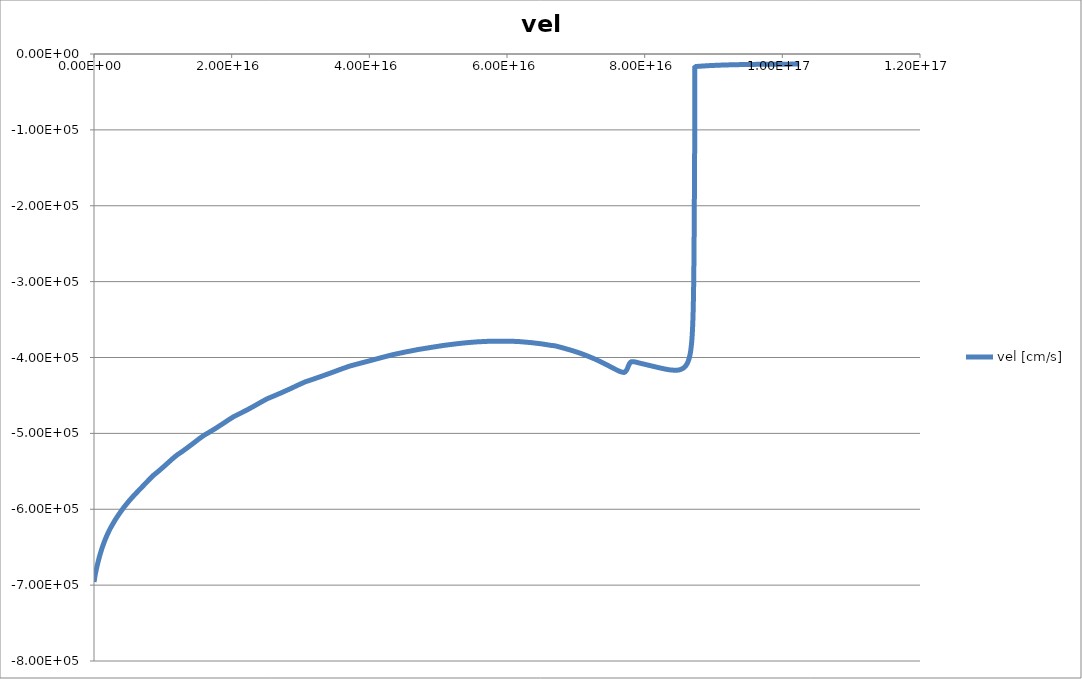
| Category | vel [cm/s] |
|---|---|
| 108724000000.0 | -695770 |
| 652347000000.0 | -695690 |
| 1765520000000.0 | -695610 |
| 3121850000000.0 | -695530 |
| 4477690000000.0 | -695430 |
| 5861580000000.0 | -695350 |
| 7465870000000.0 | -695260 |
| 9506710000000.0 | -695160 |
| 12102900000000.0 | -695050 |
| 15405600000000.0 | -694900 |
| 19606700000000.0 | -694710 |
| 24950200000000.0 | -694480 |
| 31746000000000.0 | -694180 |
| 40387700000000.0 | -693820 |
| 51374100000000.0 | -693360 |
| 65337800000000.0 | -692790 |
| 83079400000000.0 | -690980 |
| 105657000000000.0 | -690550 |
| 134384000000000.0 | -688380 |
| 170782000000000.0 | -687740 |
| 200660000000000.0 | -685150 |
| 220726000000000.0 | -684840 |
| 242798000000000.0 | -684250 |
| 267078000000000.0 | -682220 |
| 293786000000000.0 | -681790 |
| 323165000000000.0 | -679820 |
| 355481000000000.0 | -679310 |
| 391029000000000.0 | -677010 |
| 430132000000000.0 | -676410 |
| 473146000000000.0 | -673760 |
| 520460000000000.0 | -672080 |
| 572506000000000.0 | -670090 |
| 629757000000000.0 | -668040 |
| 692732000000000.0 | -665840 |
| 762006000000000.0 | -663510 |
| 838206000000000.0 | -661040 |
| 922027000000000.0 | -658430 |
| 1014230000000000.0 | -655680 |
| 1115650000000000.0 | -652780 |
| 1227220000000000.0 | -649720 |
| 1349940000000000.0 | -646530 |
| 1484930000000000.0 | -643220 |
| 1633430000000000.0 | -639770 |
| 1796770000000000.0 | -636210 |
| 1976450000000000.0 | -632530 |
| 2174090000000000.0 | -628730 |
| 2391500000000000.0 | -624830 |
| 2630650000000000.0 | -621020 |
| 2893710000000000.0 | -616860 |
| 3183090000000000.0 | -612590 |
| 3501400000000000.0 | -608180 |
| 3851530000000000.0 | -603630 |
| 4236690000000000.0 | -598730 |
| 4660360000000000.0 | -593820 |
| 5126390000000000.0 | -588710 |
| 5639030000000000.0 | -583460 |
| 6202930000000000.0 | -578000 |
| 6823230000000000.0 | -572170 |
| 7466670000000000.0 | -566050 |
| 8079730000000000.0 | -560290 |
| 8660840000000000.0 | -555050 |
| 9319990000000000.0 | -550260 |
| 1.00761e+16 | -544310 |
| 1.08106e+16 | -538300 |
| 1.14758e+16 | -532880 |
| 1.20988e+16 | -528280 |
| 1.28086e+16 | -523930 |
| 1.3648e+16 | -518380 |
| 1.44954e+16 | -512590 |
| 1.5267e+16 | -507170 |
| 1.59685e+16 | -502610 |
| 1.6748e+16 | -498490 |
| 1.76854e+16 | -493320 |
| 1.86561e+16 | -487590 |
| 1.95333e+16 | -482270 |
| 2.03022e+16 | -477910 |
| 2.11434e+16 | -474130 |
| 2.21747e+16 | -469380 |
| 2.32794e+16 | -463910 |
| 2.42933e+16 | -458650 |
| 2.51644e+16 | -454360 |
| 2.6098e+16 | -450840 |
| 2.72546e+16 | -446350 |
| 2.85085e+16 | -441220 |
| 2.96716e+16 | -436230 |
| 3.06794e+16 | -432110 |
| 3.17598e+16 | -428820 |
| 3.30903e+16 | -424630 |
| 3.45459e+16 | -419880 |
| 3.59324e+16 | -415200 |
| 3.716e+16 | -411270 |
| 3.84869e+16 | -408050 |
| 4.00673e+16 | -404270 |
| 4.17499e+16 | -400160 |
| 4.34319e+16 | -396220 |
| 4.51594e+16 | -392910 |
| 4.69794e+16 | -389660 |
| 4.88544e+16 | -386870 |
| 5.07359e+16 | -384160 |
| 5.25174e+16 | -382090 |
| 5.41581e+16 | -380470 |
| 5.56738e+16 | -379370 |
| 5.70718e+16 | -378760 |
| 5.83596e+16 | -378500 |
| 5.95503e+16 | -378430 |
| 6.06548e+16 | -378600 |
| 6.16782e+16 | -378970 |
| 6.26258e+16 | -379700 |
| 6.35019e+16 | -380400 |
| 6.43122e+16 | -381240 |
| 6.50601e+16 | -382090 |
| 6.5747e+16 | -383070 |
| 6.63787e+16 | -384040 |
| 6.67981e+16 | -384400 |
| 6.69549e+16 | -384600 |
| 6.70484e+16 | -384800 |
| 6.71701e+16 | -385060 |
| 6.73282e+16 | -385400 |
| 6.75337e+16 | -385940 |
| 6.78009e+16 | -386570 |
| 6.81482e+16 | -387410 |
| 6.85997e+16 | -388620 |
| 6.91121e+16 | -389930 |
| 6.96262e+16 | -391330 |
| 7.01404e+16 | -392830 |
| 7.06545e+16 | -394440 |
| 7.11686e+16 | -396150 |
| 7.16828e+16 | -397970 |
| 7.21969e+16 | -399900 |
| 7.27111e+16 | -401820 |
| 7.32252e+16 | -403980 |
| 7.37393e+16 | -406220 |
| 7.42427e+16 | -408500 |
| 7.46991e+16 | -410610 |
| 7.50801e+16 | -412460 |
| 7.53952e+16 | -413930 |
| 7.56684e+16 | -415210 |
| 7.59146e+16 | -416340 |
| 7.61358e+16 | -417320 |
| 7.633e+16 | -418090 |
| 7.64985e+16 | -418690 |
| 7.66461e+16 | -419050 |
| 7.67725e+16 | -419360 |
| 7.68467e+16 | -419480 |
| 7.68754e+16 | -419540 |
| 7.68956e+16 | -419580 |
| 7.69111e+16 | -419600 |
| 7.69237e+16 | -419640 |
| 7.69343e+16 | -419660 |
| 7.69437e+16 | -419680 |
| 7.6952e+16 | -419700 |
| 7.69595e+16 | -419710 |
| 7.69663e+16 | -419730 |
| 7.69726e+16 | -419730 |
| 7.69785e+16 | -419740 |
| 7.69838e+16 | -419740 |
| 7.69887e+16 | -419740 |
| 7.69932e+16 | -419740 |
| 7.69975e+16 | -419730 |
| 7.70018e+16 | -419720 |
| 7.70062e+16 | -419710 |
| 7.70105e+16 | -419720 |
| 7.70149e+16 | -419700 |
| 7.70193e+16 | -419660 |
| 7.70237e+16 | -419520 |
| 7.7028e+16 | -419490 |
| 7.70324e+16 | -419460 |
| 7.70367e+16 | -419460 |
| 7.70411e+16 | -419430 |
| 7.70462e+16 | -419420 |
| 7.70527e+16 | -419390 |
| 7.70612e+16 | -419370 |
| 7.70723e+16 | -419330 |
| 7.70867e+16 | -419260 |
| 7.71054e+16 | -419190 |
| 7.71297e+16 | -419090 |
| 7.71613e+16 | -418940 |
| 7.72024e+16 | -418680 |
| 7.72558e+16 | -418130 |
| 7.73253e+16 | -417330 |
| 7.74156e+16 | -415930 |
| 7.751e+16 | -414040 |
| 7.75895e+16 | -412190 |
| 7.76726e+16 | -410310 |
| 7.77807e+16 | -408240 |
| 7.79212e+16 | -406510 |
| 7.81039e+16 | -405460 |
| 7.83414e+16 | -405520 |
| 7.86502e+16 | -405920 |
| 7.90515e+16 | -406870 |
| 7.95355e+16 | -407970 |
| 8.00496e+16 | -409070 |
| 8.05637e+16 | -410190 |
| 8.10779e+16 | -411310 |
| 8.1592e+16 | -412400 |
| 8.21061e+16 | -413540 |
| 8.26202e+16 | -414550 |
| 8.31344e+16 | -415500 |
| 8.36485e+16 | -416300 |
| 8.41481e+16 | -416660 |
| 8.45951e+16 | -416790 |
| 8.49657e+16 | -416480 |
| 8.52717e+16 | -415600 |
| 8.55359e+16 | -414450 |
| 8.57711e+16 | -412950 |
| 8.59795e+16 | -410820 |
| 8.61592e+16 | -408290 |
| 8.63113e+16 | -405270 |
| 8.64404e+16 | -401840 |
| 8.65514e+16 | -397920 |
| 8.66477e+16 | -393370 |
| 8.6731e+16 | -388230 |
| 8.68004e+16 | -382690 |
| 8.68558e+16 | -376960 |
| 8.69002e+16 | -371240 |
| 8.69357e+16 | -365670 |
| 8.69641e+16 | -360360 |
| 8.69869e+16 | -355420 |
| 8.7005e+16 | -350910 |
| 8.70196e+16 | -346880 |
| 8.70316e+16 | -343240 |
| 8.70424e+16 | -339700 |
| 8.70527e+16 | -336070 |
| 8.70624e+16 | -332350 |
| 8.70712e+16 | -328690 |
| 8.70792e+16 | -325170 |
| 8.70864e+16 | -321760 |
| 8.70931e+16 | -318380 |
| 8.70994e+16 | -315000 |
| 8.71053e+16 | -311650 |
| 8.71109e+16 | -308350 |
| 8.7116e+16 | -305120 |
| 8.71209e+16 | -301940 |
| 8.71254e+16 | -298790 |
| 8.71298e+16 | -295660 |
| 8.71339e+16 | -292580 |
| 8.71378e+16 | -289540 |
| 8.71415e+16 | -286540 |
| 8.71451e+16 | -283580 |
| 8.71485e+16 | -280650 |
| 8.71517e+16 | -277750 |
| 8.71548e+16 | -274890 |
| 8.71578e+16 | -272060 |
| 8.71606e+16 | -269270 |
| 8.71634e+16 | -266510 |
| 8.71661e+16 | -263770 |
| 8.71686e+16 | -261070 |
| 8.71711e+16 | -258410 |
| 8.71735e+16 | -255770 |
| 8.71758e+16 | -253160 |
| 8.71781e+16 | -250580 |
| 8.71803e+16 | -248030 |
| 8.71824e+16 | -245500 |
| 8.71845e+16 | -243010 |
| 8.71865e+16 | -240540 |
| 8.71885e+16 | -238100 |
| 8.71904e+16 | -235690 |
| 8.71923e+16 | -233300 |
| 8.71941e+16 | -230940 |
| 8.71959e+16 | -228600 |
| 8.71976e+16 | -226290 |
| 8.71993e+16 | -224010 |
| 8.7201e+16 | -221740 |
| 8.72026e+16 | -219510 |
| 8.72042e+16 | -217290 |
| 8.72058e+16 | -215100 |
| 8.72074e+16 | -212930 |
| 8.72089e+16 | -210790 |
| 8.72104e+16 | -208660 |
| 8.72118e+16 | -206560 |
| 8.72133e+16 | -204480 |
| 8.72147e+16 | -202420 |
| 8.72161e+16 | -200390 |
| 8.72175e+16 | -198370 |
| 8.72188e+16 | -196380 |
| 8.72202e+16 | -194400 |
| 8.72215e+16 | -192450 |
| 8.72228e+16 | -190510 |
| 8.7224e+16 | -188600 |
| 8.72253e+16 | -186700 |
| 8.72265e+16 | -184820 |
| 8.72277e+16 | -182960 |
| 8.72289e+16 | -181130 |
| 8.72301e+16 | -179300 |
| 8.72312e+16 | -177500 |
| 8.72324e+16 | -175710 |
| 8.72335e+16 | -173950 |
| 8.72346e+16 | -172200 |
| 8.72357e+16 | -170460 |
| 8.72367e+16 | -168750 |
| 8.72378e+16 | -167050 |
| 8.72388e+16 | -165370 |
| 8.72398e+16 | -163700 |
| 8.72408e+16 | -162060 |
| 8.72418e+16 | -160430 |
| 8.72428e+16 | -158810 |
| 8.72437e+16 | -157210 |
| 8.72446e+16 | -155630 |
| 8.72456e+16 | -154070 |
| 8.72465e+16 | -152520 |
| 8.72474e+16 | -150980 |
| 8.72482e+16 | -149460 |
| 8.72491e+16 | -147950 |
| 8.725e+16 | -146430 |
| 8.72509e+16 | -144900 |
| 8.72517e+16 | -143360 |
| 8.72526e+16 | -141820 |
| 8.72535e+16 | -140270 |
| 8.72543e+16 | -138720 |
| 8.72552e+16 | -137170 |
| 8.72561e+16 | -135600 |
| 8.7257e+16 | -134040 |
| 8.72578e+16 | -132480 |
| 8.72587e+16 | -130910 |
| 8.72596e+16 | -129350 |
| 8.72605e+16 | -127770 |
| 8.72613e+16 | -126200 |
| 8.72622e+16 | -124630 |
| 8.72631e+16 | -123050 |
| 8.72639e+16 | -121460 |
| 8.72648e+16 | -119870 |
| 8.72657e+16 | -118280 |
| 8.72666e+16 | -116670 |
| 8.72674e+16 | -115050 |
| 8.72683e+16 | -113400 |
| 8.72692e+16 | -111730 |
| 8.72701e+16 | -110030 |
| 8.72709e+16 | -108290 |
| 8.72718e+16 | -106490 |
| 8.72727e+16 | -104620 |
| 8.72735e+16 | -102670 |
| 8.72744e+16 | -100600 |
| 8.72753e+16 | -98387 |
| 8.72762e+16 | -95964 |
| 8.7277e+16 | -93262 |
| 8.72779e+16 | -90150 |
| 8.72788e+16 | -86398 |
| 8.72797e+16 | -81557 |
| 8.72805e+16 | -74503 |
| 8.72814e+16 | -60290 |
| 8.72823e+16 | -34280 |
| 8.72831e+16 | -22802 |
| 8.7284e+16 | -19393 |
| 8.72849e+16 | -18229 |
| 8.72858e+16 | -17665 |
| 8.72866e+16 | -17332 |
| 8.72875e+16 | -17113 |
| 8.72884e+16 | -16961 |
| 8.72893e+16 | -16852 |
| 8.72901e+16 | -16775 |
| 8.7291e+16 | -16720 |
| 8.72919e+16 | -16682 |
| 8.72927e+16 | -16657 |
| 8.72936e+16 | -16640 |
| 8.72945e+16 | -16625 |
| 8.72954e+16 | -16620 |
| 8.72962e+16 | -16616 |
| 8.72971e+16 | -16613 |
| 8.7298e+16 | -16611 |
| 8.72989e+16 | -16609 |
| 8.72999e+16 | -16608 |
| 8.73012e+16 | -16606 |
| 8.73029e+16 | -16603 |
| 8.73051e+16 | -16601 |
| 8.73079e+16 | -16598 |
| 8.73117e+16 | -16594 |
| 8.73165e+16 | -16590 |
| 8.73228e+16 | -16585 |
| 8.7331e+16 | -16578 |
| 8.73416e+16 | -16570 |
| 8.73555e+16 | -16559 |
| 8.73735e+16 | -16545 |
| 8.73969e+16 | -16531 |
| 8.74273e+16 | -16510 |
| 8.74668e+16 | -16482 |
| 8.75182e+16 | -16445 |
| 8.7585e+16 | -16399 |
| 8.76718e+16 | -16340 |
| 8.77847e+16 | -16264 |
| 8.79315e+16 | -16169 |
| 8.81223e+16 | -16051 |
| 8.83703e+16 | -15905 |
| 8.86681e+16 | -15728 |
| 8.8966e+16 | -15546 |
| 8.92261e+16 | -15396 |
| 8.94981e+16 | -15276 |
| 8.98366e+16 | -15133 |
| 9.02174e+16 | -14974 |
| 9.05952e+16 | -14822 |
| 9.09573e+16 | -14693 |
| 9.13298e+16 | -14576 |
| 9.17358e+16 | -14462 |
| 9.21647e+16 | -14347 |
| 9.25815e+16 | -14242 |
| 9.29645e+16 | -14153 |
| 9.33245e+16 | -14079 |
| 9.36909e+16 | -14013 |
| 9.40847e+16 | -13949 |
| 9.44997e+16 | -13884 |
| 9.49074e+16 | -13824 |
| 9.52876e+16 | -13772 |
| 9.56465e+16 | -13728 |
| 9.60078e+16 | -13689 |
| 9.63903e+16 | -13651 |
| 9.67909e+16 | -13613 |
| 9.71874e+16 | -13578 |
| 9.75614e+16 | -13547 |
| 9.79156e+16 | -13520 |
| 9.82687e+16 | -13496 |
| 9.86371e+16 | -13472 |
| 9.90204e+16 | -13450 |
| 9.94013e+16 | -13428 |
| 9.97635e+16 | -13408 |
| 1.00107e+17 | -13391 |
| 1.00447e+17 | -13376 |
| 1.00797e+17 | -13362 |
| 1.01157e+17 | -13347 |
| 1.01517e+17 | -13334 |
| 1.0186e+17 | -13321 |
| 1.02186e+17 | -13310 |
| 1.02469e+17 | -13297 |